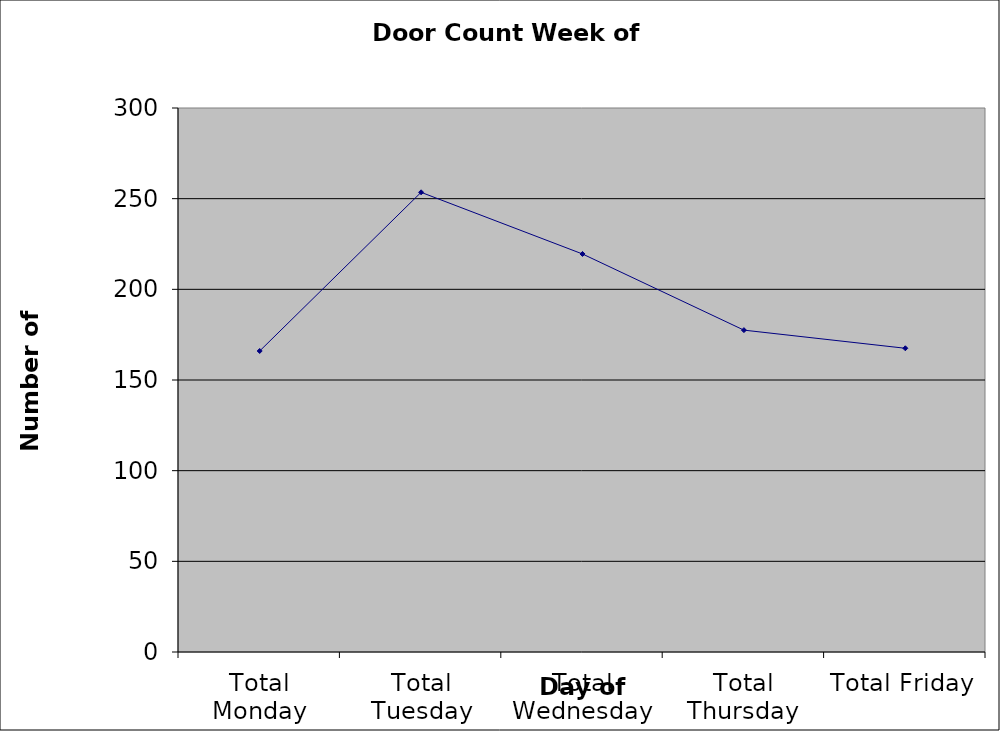
| Category | Series 0 |
|---|---|
| Total Monday | 166 |
| Total Tuesday | 253.5 |
| Total Wednesday | 219.5 |
| Total Thursday | 177.5 |
| Total Friday | 167.5 |